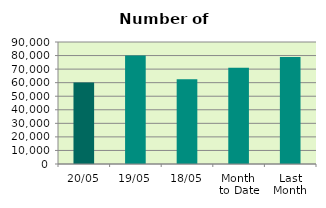
| Category | Series 0 |
|---|---|
| 20/05 | 60164 |
| 19/05 | 79988 |
| 18/05 | 62452 |
| Month 
to Date | 71030.923 |
| Last
Month | 78959.6 |